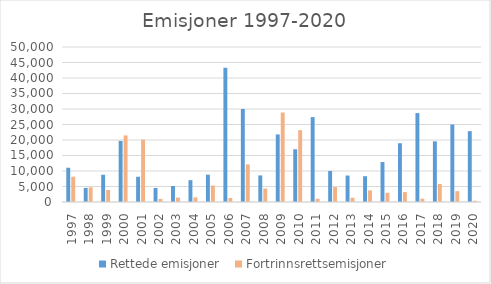
| Category | Rettede emisjoner  | Fortrinnsrettsemisjoner |
|---|---|---|
| 1997.0 | 11049 | 8136 |
| 1998.0 | 4548 | 4736 |
| 1999.0 | 8796 | 3881 |
| 2000.0 | 19713 | 21478 |
| 2001.0 | 8144 | 20116 |
| 2002.0 | 4520 | 980 |
| 2003.0 | 5170 | 1420 |
| 2004.0 | 7045 | 1496 |
| 2005.0 | 8820 | 5308 |
| 2006.0 | 43308 | 1300 |
| 2007.0 | 29996 | 12123 |
| 2008.0 | 8573 | 4342 |
| 2009.0 | 21793 | 28873 |
| 2010.0 | 17005 | 23176 |
| 2011.0 | 27398 | 1044 |
| 2012.0 | 10016 | 4809 |
| 2013.0 | 8544 | 1362 |
| 2014.0 | 8321 | 3732 |
| 2015.0 | 12889 | 2946 |
| 2016.0 | 18960 | 3192 |
| 2017.0 | 28687 | 1063 |
| 2018.0 | 19567 | 5830 |
| 2019.0 | 25004 | 3500 |
| 2020.0 | 22855 | 400 |